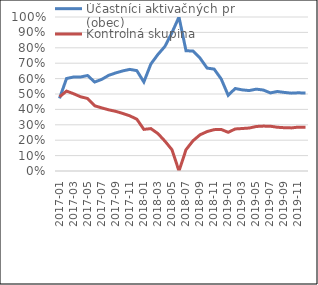
| Category | Účastníci aktivačných prác (obec) | Kontrolná skupina |
|---|---|---|
| 2017-01 | 0.472 | 0.482 |
| 2017-02 | 0.601 | 0.519 |
| 2017-03 | 0.61 | 0.502 |
| 2017-04 | 0.61 | 0.482 |
| 2017-05 | 0.62 | 0.471 |
| 2017-06 | 0.578 | 0.424 |
| 2017-07 | 0.595 | 0.41 |
| 2017-08 | 0.621 | 0.397 |
| 2017-09 | 0.637 | 0.387 |
| 2017-10 | 0.65 | 0.374 |
| 2017-11 | 0.66 | 0.358 |
| 2017-12 | 0.652 | 0.337 |
| 2018-01 | 0.578 | 0.27 |
| 2018-02 | 0.695 | 0.275 |
| 2018-03 | 0.757 | 0.243 |
| 2018-04 | 0.809 | 0.194 |
| 2018-05 | 0.898 | 0.138 |
| 2018-06 | 1 | 0 |
| 2018-07 | 0.781 | 0.138 |
| 2018-08 | 0.779 | 0.197 |
| 2018-09 | 0.733 | 0.235 |
| 2018-10 | 0.668 | 0.256 |
| 2018-11 | 0.662 | 0.269 |
| 2018-12 | 0.598 | 0.27 |
| 2019-01 | 0.492 | 0.251 |
| 2019-02 | 0.536 | 0.273 |
| 2019-03 | 0.527 | 0.276 |
| 2019-04 | 0.522 | 0.279 |
| 2019-05 | 0.532 | 0.289 |
| 2019-06 | 0.526 | 0.292 |
| 2019-07 | 0.507 | 0.291 |
| 2019-08 | 0.516 | 0.284 |
| 2019-09 | 0.51 | 0.281 |
| 2019-10 | 0.506 | 0.28 |
| 2019-11 | 0.508 | 0.285 |
| 2019-12 | 0.506 | 0.284 |